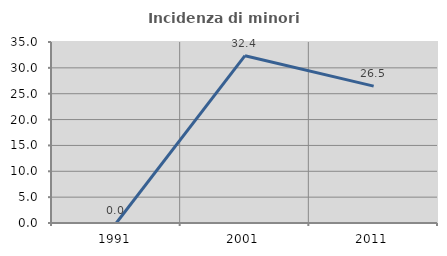
| Category | Incidenza di minori stranieri |
|---|---|
| 1991.0 | 0 |
| 2001.0 | 32.353 |
| 2011.0 | 26.471 |